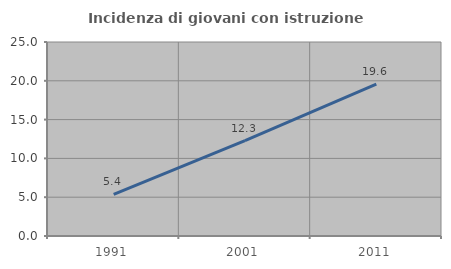
| Category | Incidenza di giovani con istruzione universitaria |
|---|---|
| 1991.0 | 5.357 |
| 2001.0 | 12.291 |
| 2011.0 | 19.58 |